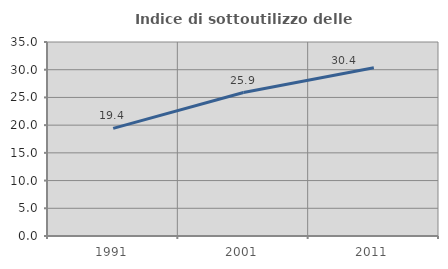
| Category | Indice di sottoutilizzo delle abitazioni  |
|---|---|
| 1991.0 | 19.409 |
| 2001.0 | 25.882 |
| 2011.0 | 30.365 |